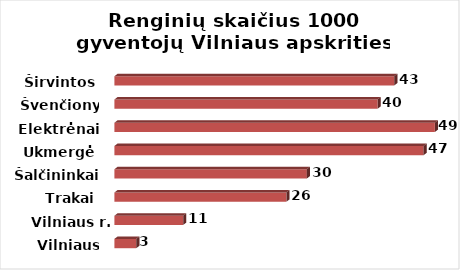
| Category | Series 0 |
|---|---|
| Vilniaus m. | 3.352 |
| Vilniaus r. | 10.561 |
| Trakai | 26.422 |
| Šalčininkai | 29.563 |
| Ukmergė | 47.49 |
| Elektrėnai | 49.233 |
| Švenčionys | 40.44 |
| Širvintos | 42.985 |